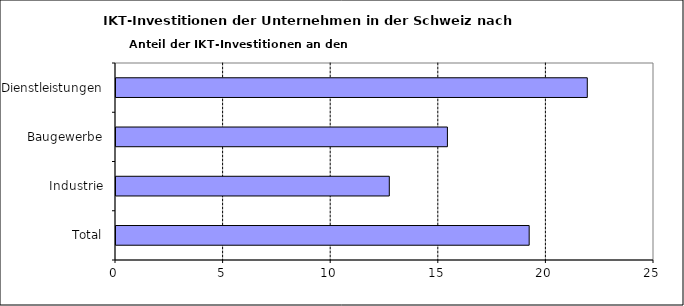
| Category | Series 0 |
|---|---|
| Total | 19.2 |
| Industrie | 12.7 |
| Baugewerbe | 15.4 |
| Dienstleistungen | 21.9 |